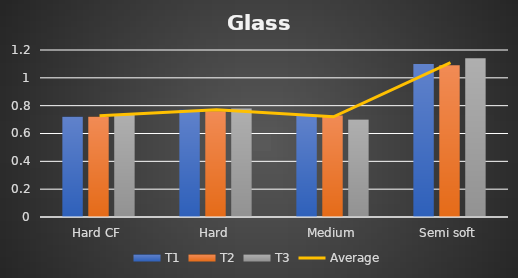
| Category | T1 | T2 | T3 |
|---|---|---|---|
| Hard CF | 0.72 | 0.72 | 0.74 |
| Hard | 0.77 | 0.76 | 0.78 |
| Medium | 0.73 | 0.73 | 0.7 |
| Semi soft | 1.1 | 1.09 | 1.14 |